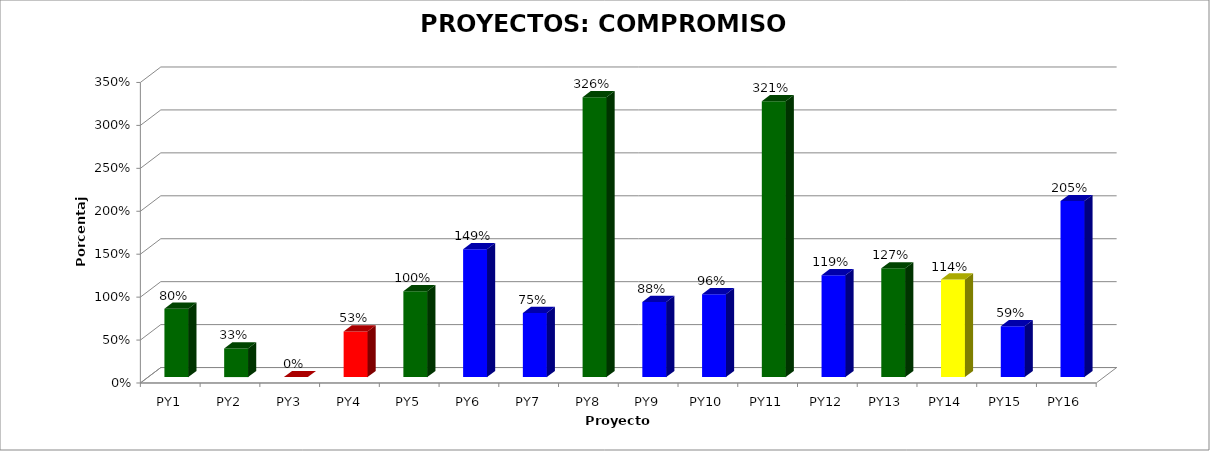
| Category | Series 0 |
|---|---|
| PY1 | 0.795 |
| PY2 | 0.333 |
| PY3 | 0 |
| PY4 | 0.531 |
| PY5 | 1 |
| PY6 | 1.49 |
| PY7 | 0.746 |
| PY8 | 3.26 |
| PY9 | 0.875 |
| PY10 | 0.965 |
| PY11 | 3.212 |
| PY12 | 1.187 |
| PY13 | 1.267 |
| PY14 | 1.136 |
| PY15 | 0.591 |
| PY16 | 2.05 |